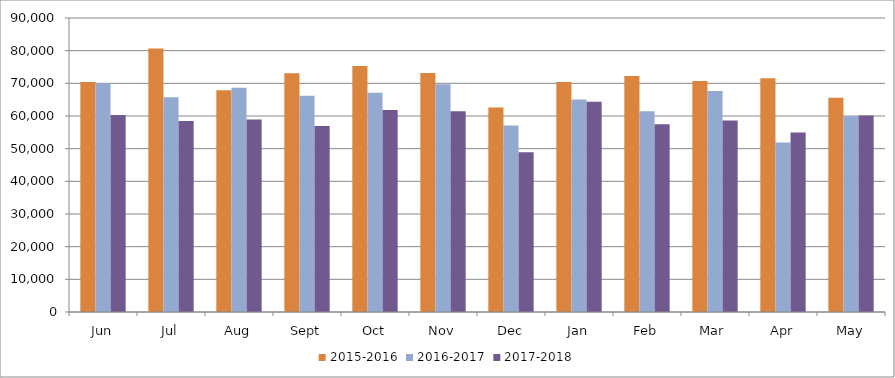
| Category | 2015-2016 | 2016-2017 | 2017-2018 |
|---|---|---|---|
| Jun | 70433 | 69958 | 60272 |
| Jul | 80627 | 65733 | 58496 |
| Aug | 67852 | 68633 | 58944 |
| Sept | 73089 | 66198 | 56930 |
| Oct | 75285 | 67123 | 61811 |
| Nov | 73188 | 69750 | 61491 |
| Dec | 62603 | 57126 | 48926 |
| Jan | 70399 | 65087 | 64354 |
| Feb | 72265 | 61428 | 57453 |
| Mar  | 70736 | 67683 | 58637 |
| Apr | 71519 | 51901 | 54957 |
| May | 65555 | 59952 | 60128 |